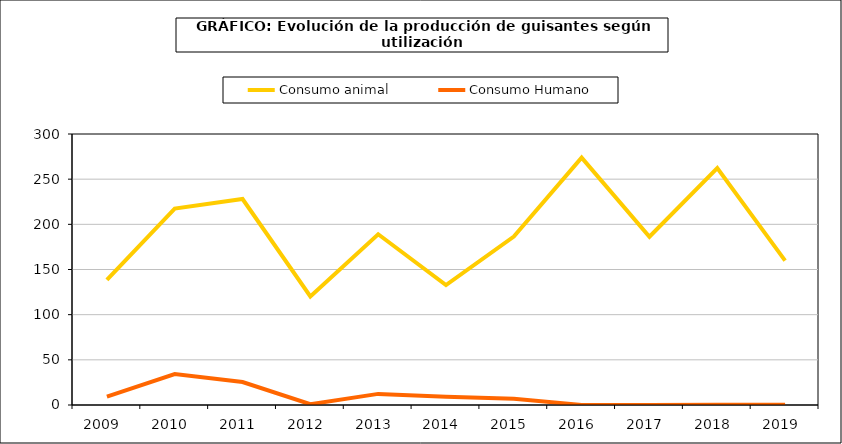
| Category | Consumo animal | Consumo Humano |
|---|---|---|
| 2009.0 | 138.522 | 9.348 |
| 2010.0 | 217.397 | 34.178 |
| 2011.0 | 228.032 | 25.395 |
| 2012.0 | 120.217 | 0.857 |
| 2013.0 | 189.031 | 12.295 |
| 2014.0 | 132.687 | 9.168 |
| 2015.0 | 186.379 | 7.01 |
| 2016.0 | 273.873 | 0.081 |
| 2017.0 | 186.313 | 0.093 |
| 2018.0 | 262.231 | 0.336 |
| 2019.0 | 159.821 | 0.294 |